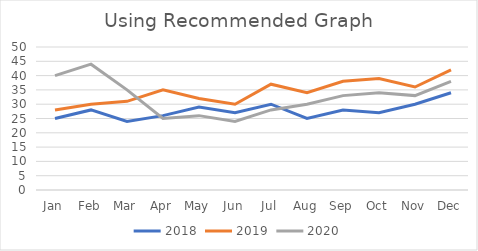
| Category | 2018 | 2019 | 2020 |
|---|---|---|---|
| Jan | 25 | 28 | 40 |
| Feb | 28 | 30 | 44 |
| Mar | 24 | 31 | 35 |
| Apr | 26 | 35 | 25 |
| May | 29 | 32 | 26 |
| Jun | 27 | 30 | 24 |
| Jul | 30 | 37 | 28 |
| Aug | 25 | 34 | 30 |
| Sep | 28 | 38 | 33 |
| Oct | 27 | 39 | 34 |
| Nov | 30 | 36 | 33 |
| Dec | 34 | 42 | 38 |